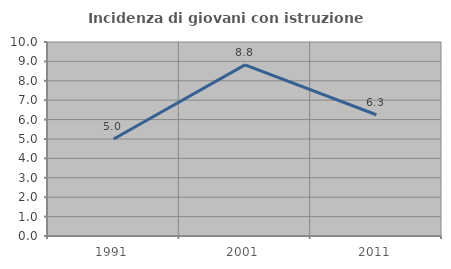
| Category | Incidenza di giovani con istruzione universitaria |
|---|---|
| 1991.0 | 5 |
| 2001.0 | 8.824 |
| 2011.0 | 6.25 |